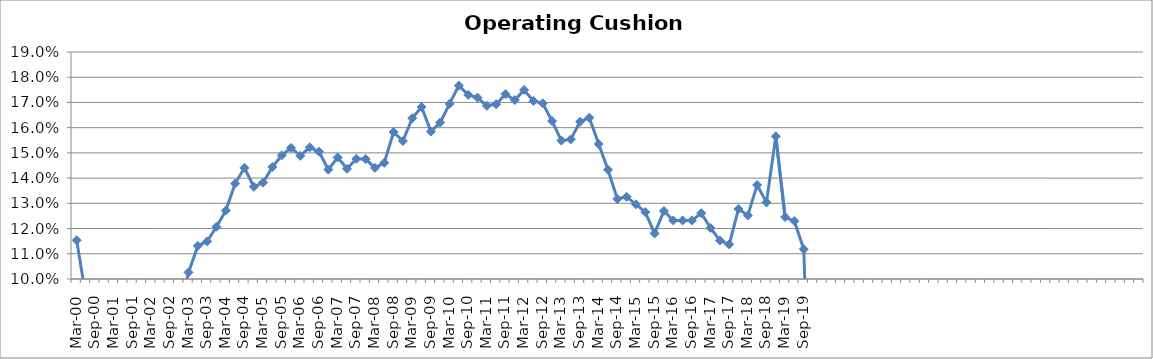
| Category | Operating Cushion % |
|---|---|
| Mar-00 | 0.115 |
| Jun-00 | 0.093 |
| Sep-00 | 0.069 |
| Dec-00 | 0.02 |
| Mar-01 | 0.01 |
| Jun-01 | 0.013 |
| Sep-01 | 0.001 |
| Dec-01 | 0.051 |
| Mar-02 | 0.056 |
| Jun-02 | 0.078 |
| Sep-02 | 0.077 |
| Dec-02 | 0.086 |
| Mar-03 | 0.103 |
| Jun-03 | 0.113 |
| Sep-03 | 0.115 |
| Dec-03 | 0.121 |
| Mar-04 | 0.127 |
| Jun-04 | 0.138 |
| Sep-04 | 0.144 |
| Dec-04 | 0.137 |
| Mar-05 | 0.138 |
| Jun-05 | 0.144 |
| Sep-05 | 0.149 |
| Dec-05 | 0.152 |
| Mar-06 | 0.149 |
| Jun-06 | 0.152 |
| Sep-06 | 0.15 |
| Dec-06 | 0.143 |
| Mar-07 | 0.148 |
| Jun-07 | 0.144 |
| Sep-07 | 0.148 |
| Dec-07 | 0.148 |
| Mar-08 | 0.144 |
| Jun-08 | 0.146 |
| Sep-08 | 0.158 |
| Dec-08 | 0.155 |
| Mar-09 | 0.164 |
| Jun-09 | 0.168 |
| Sep-09 | 0.158 |
| Dec-09 | 0.162 |
| Mar-10 | 0.169 |
| Jun-10 | 0.177 |
| Sep-10 | 0.173 |
| Dec-10 | 0.172 |
| Mar-11 | 0.169 |
| Jun-11 | 0.169 |
| Sep-11 | 0.173 |
| Dec-11 | 0.171 |
| Mar-12 | 0.175 |
| Jun-12 | 0.171 |
| Sep-12 | 0.17 |
| Dec-12 | 0.163 |
| Mar-13 | 0.155 |
| Jun-13 | 0.155 |
| Sep-13 | 0.162 |
| Dec-13 | 0.164 |
| Mar-14 | 0.154 |
| Jun-14 | 0.143 |
| Sep-14 | 0.132 |
| Dec-14 | 0.133 |
| Mar-15 | 0.13 |
| Jun-15 | 0.127 |
| Sep-15 | 0.118 |
| Dec-15 | 0.127 |
| Mar-16 | 0.123 |
| Jun-16 | 0.123 |
| Sep-16 | 0.123 |
| Dec-16 | 0.126 |
| Mar-17 | 0.12 |
| Jun-17 | 0.115 |
| Sep-17 | 0.114 |
| Dec-17 | 0.128 |
| Mar-18 | 0.125 |
| Jun-18 | 0.137 |
| Sep-18 | 0.13 |
| Dec-18 | 0.157 |
| Mar-19 | 0.125 |
| Jun-19 | 0.123 |
| Sep-19 | 0.112 |